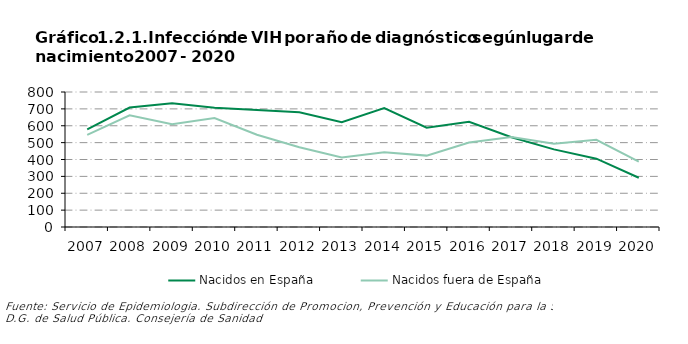
| Category | Nacidos en España | Nacidos fuera de España |
|---|---|---|
| 0 | 578 | 546 |
| 1 | 708 | 662 |
| 2 | 734 | 609 |
| 3 | 706 | 646 |
| 4 | 693 | 547 |
| 5 | 680 | 473 |
| 6 | 621 | 412 |
| 7 | 705 | 443 |
| 8 | 588 | 423 |
| 9 | 623 | 501 |
| 10 | 532 | 533 |
| 11 | 460 | 494 |
| 12 | 405 | 517 |
| 13 | 292 | 387 |